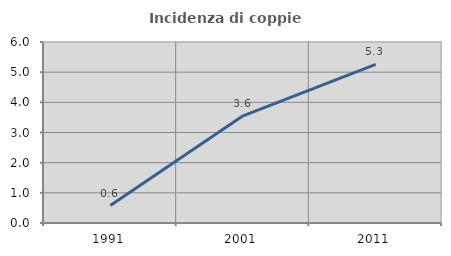
| Category | Incidenza di coppie miste |
|---|---|
| 1991.0 | 0.577 |
| 2001.0 | 3.553 |
| 2011.0 | 5.255 |